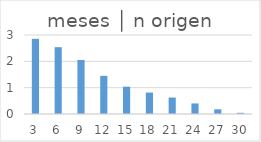
| Category | meses │ n origen |
|---|---|
| 3.0 | 2.855 |
| 6.0 | 2.537 |
| 9.0 | 2.052 |
| 12.0 | 1.45 |
| 15.0 | 1.037 |
| 18.0 | 0.814 |
| 21.0 | 0.625 |
| 24.0 | 0.401 |
| 27.0 | 0.178 |
| 30.0 | 0.045 |